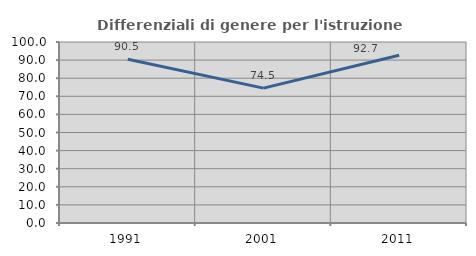
| Category | Differenziali di genere per l'istruzione superiore |
|---|---|
| 1991.0 | 90.514 |
| 2001.0 | 74.499 |
| 2011.0 | 92.671 |